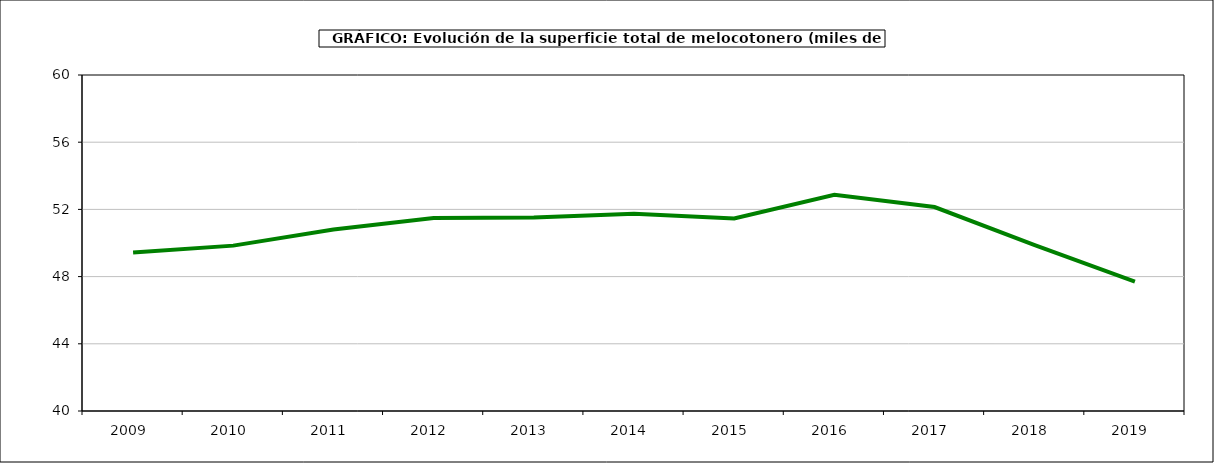
| Category | superficie melocotonero |
|---|---|
| 2009.0 | 49.441 |
| 2010.0 | 49.844 |
| 2011.0 | 50.805 |
| 2012.0 | 51.491 |
| 2013.0 | 51.511 |
| 2014.0 | 51.746 |
| 2015.0 | 51.458 |
| 2016.0 | 52.875 |
| 2017.0 | 52.141 |
| 2018.0 | 49.868 |
| 2019.0 | 47.707 |